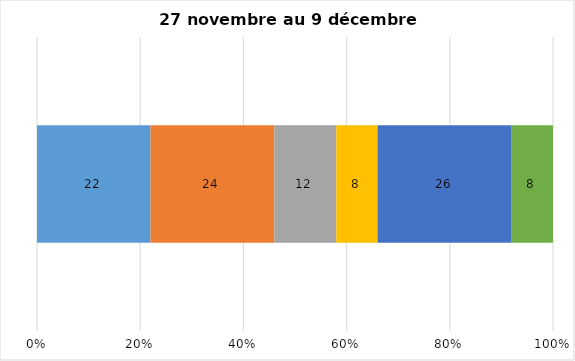
| Category | Plusieurs fois par jour | Une fois par jour | Quelques fois par semaine   | Une fois par semaine ou moins   |  Jamais   |  Je n’utilise pas les médias sociaux |
|---|---|---|---|---|---|---|
| 0 | 22 | 24 | 12 | 8 | 26 | 8 |